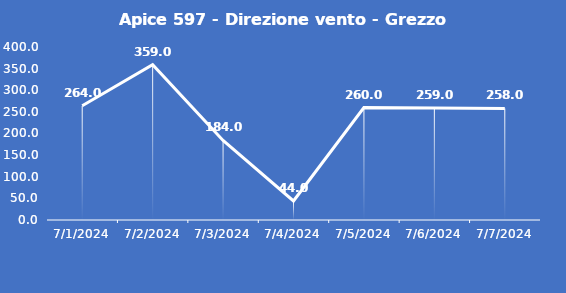
| Category | Apice 597 - Direzione vento - Grezzo (°N) |
|---|---|
| 7/1/24 | 264 |
| 7/2/24 | 359 |
| 7/3/24 | 184 |
| 7/4/24 | 44 |
| 7/5/24 | 260 |
| 7/6/24 | 259 |
| 7/7/24 | 258 |